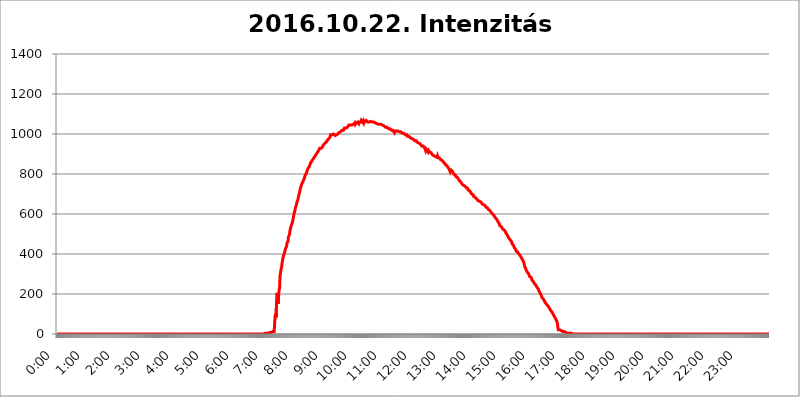
| Category | 2016.10.22. Intenzitás [W/m^2] |
|---|---|
| 0.0 | 0 |
| 0.0006944444444444445 | 0 |
| 0.001388888888888889 | 0 |
| 0.0020833333333333333 | 0 |
| 0.002777777777777778 | 0 |
| 0.003472222222222222 | 0 |
| 0.004166666666666667 | 0 |
| 0.004861111111111111 | 0 |
| 0.005555555555555556 | 0 |
| 0.0062499999999999995 | 0 |
| 0.006944444444444444 | 0 |
| 0.007638888888888889 | 0 |
| 0.008333333333333333 | 0 |
| 0.009027777777777779 | 0 |
| 0.009722222222222222 | 0 |
| 0.010416666666666666 | 0 |
| 0.011111111111111112 | 0 |
| 0.011805555555555555 | 0 |
| 0.012499999999999999 | 0 |
| 0.013194444444444444 | 0 |
| 0.013888888888888888 | 0 |
| 0.014583333333333332 | 0 |
| 0.015277777777777777 | 0 |
| 0.015972222222222224 | 0 |
| 0.016666666666666666 | 0 |
| 0.017361111111111112 | 0 |
| 0.018055555555555557 | 0 |
| 0.01875 | 0 |
| 0.019444444444444445 | 0 |
| 0.02013888888888889 | 0 |
| 0.020833333333333332 | 0 |
| 0.02152777777777778 | 0 |
| 0.022222222222222223 | 0 |
| 0.02291666666666667 | 0 |
| 0.02361111111111111 | 0 |
| 0.024305555555555556 | 0 |
| 0.024999999999999998 | 0 |
| 0.025694444444444447 | 0 |
| 0.02638888888888889 | 0 |
| 0.027083333333333334 | 0 |
| 0.027777777777777776 | 0 |
| 0.02847222222222222 | 0 |
| 0.029166666666666664 | 0 |
| 0.029861111111111113 | 0 |
| 0.030555555555555555 | 0 |
| 0.03125 | 0 |
| 0.03194444444444445 | 0 |
| 0.03263888888888889 | 0 |
| 0.03333333333333333 | 0 |
| 0.034027777777777775 | 0 |
| 0.034722222222222224 | 0 |
| 0.035416666666666666 | 0 |
| 0.036111111111111115 | 0 |
| 0.03680555555555556 | 0 |
| 0.0375 | 0 |
| 0.03819444444444444 | 0 |
| 0.03888888888888889 | 0 |
| 0.03958333333333333 | 0 |
| 0.04027777777777778 | 0 |
| 0.04097222222222222 | 0 |
| 0.041666666666666664 | 0 |
| 0.042361111111111106 | 0 |
| 0.04305555555555556 | 0 |
| 0.043750000000000004 | 0 |
| 0.044444444444444446 | 0 |
| 0.04513888888888889 | 0 |
| 0.04583333333333334 | 0 |
| 0.04652777777777778 | 0 |
| 0.04722222222222222 | 0 |
| 0.04791666666666666 | 0 |
| 0.04861111111111111 | 0 |
| 0.049305555555555554 | 0 |
| 0.049999999999999996 | 0 |
| 0.05069444444444445 | 0 |
| 0.051388888888888894 | 0 |
| 0.052083333333333336 | 0 |
| 0.05277777777777778 | 0 |
| 0.05347222222222222 | 0 |
| 0.05416666666666667 | 0 |
| 0.05486111111111111 | 0 |
| 0.05555555555555555 | 0 |
| 0.05625 | 0 |
| 0.05694444444444444 | 0 |
| 0.057638888888888885 | 0 |
| 0.05833333333333333 | 0 |
| 0.05902777777777778 | 0 |
| 0.059722222222222225 | 0 |
| 0.06041666666666667 | 0 |
| 0.061111111111111116 | 0 |
| 0.06180555555555556 | 0 |
| 0.0625 | 0 |
| 0.06319444444444444 | 0 |
| 0.06388888888888888 | 0 |
| 0.06458333333333334 | 0 |
| 0.06527777777777778 | 0 |
| 0.06597222222222222 | 0 |
| 0.06666666666666667 | 0 |
| 0.06736111111111111 | 0 |
| 0.06805555555555555 | 0 |
| 0.06874999999999999 | 0 |
| 0.06944444444444443 | 0 |
| 0.07013888888888889 | 0 |
| 0.07083333333333333 | 0 |
| 0.07152777777777779 | 0 |
| 0.07222222222222223 | 0 |
| 0.07291666666666667 | 0 |
| 0.07361111111111111 | 0 |
| 0.07430555555555556 | 0 |
| 0.075 | 0 |
| 0.07569444444444444 | 0 |
| 0.0763888888888889 | 0 |
| 0.07708333333333334 | 0 |
| 0.07777777777777778 | 0 |
| 0.07847222222222222 | 0 |
| 0.07916666666666666 | 0 |
| 0.0798611111111111 | 0 |
| 0.08055555555555556 | 0 |
| 0.08125 | 0 |
| 0.08194444444444444 | 0 |
| 0.08263888888888889 | 0 |
| 0.08333333333333333 | 0 |
| 0.08402777777777777 | 0 |
| 0.08472222222222221 | 0 |
| 0.08541666666666665 | 0 |
| 0.08611111111111112 | 0 |
| 0.08680555555555557 | 0 |
| 0.08750000000000001 | 0 |
| 0.08819444444444445 | 0 |
| 0.08888888888888889 | 0 |
| 0.08958333333333333 | 0 |
| 0.09027777777777778 | 0 |
| 0.09097222222222222 | 0 |
| 0.09166666666666667 | 0 |
| 0.09236111111111112 | 0 |
| 0.09305555555555556 | 0 |
| 0.09375 | 0 |
| 0.09444444444444444 | 0 |
| 0.09513888888888888 | 0 |
| 0.09583333333333333 | 0 |
| 0.09652777777777777 | 0 |
| 0.09722222222222222 | 0 |
| 0.09791666666666667 | 0 |
| 0.09861111111111111 | 0 |
| 0.09930555555555555 | 0 |
| 0.09999999999999999 | 0 |
| 0.10069444444444443 | 0 |
| 0.1013888888888889 | 0 |
| 0.10208333333333335 | 0 |
| 0.10277777777777779 | 0 |
| 0.10347222222222223 | 0 |
| 0.10416666666666667 | 0 |
| 0.10486111111111111 | 0 |
| 0.10555555555555556 | 0 |
| 0.10625 | 0 |
| 0.10694444444444444 | 0 |
| 0.1076388888888889 | 0 |
| 0.10833333333333334 | 0 |
| 0.10902777777777778 | 0 |
| 0.10972222222222222 | 0 |
| 0.1111111111111111 | 0 |
| 0.11180555555555556 | 0 |
| 0.11180555555555556 | 0 |
| 0.1125 | 0 |
| 0.11319444444444444 | 0 |
| 0.11388888888888889 | 0 |
| 0.11458333333333333 | 0 |
| 0.11527777777777777 | 0 |
| 0.11597222222222221 | 0 |
| 0.11666666666666665 | 0 |
| 0.1173611111111111 | 0 |
| 0.11805555555555557 | 0 |
| 0.11944444444444445 | 0 |
| 0.12013888888888889 | 0 |
| 0.12083333333333333 | 0 |
| 0.12152777777777778 | 0 |
| 0.12222222222222223 | 0 |
| 0.12291666666666667 | 0 |
| 0.12291666666666667 | 0 |
| 0.12361111111111112 | 0 |
| 0.12430555555555556 | 0 |
| 0.125 | 0 |
| 0.12569444444444444 | 0 |
| 0.12638888888888888 | 0 |
| 0.12708333333333333 | 0 |
| 0.16875 | 0 |
| 0.12847222222222224 | 0 |
| 0.12916666666666668 | 0 |
| 0.12986111111111112 | 0 |
| 0.13055555555555556 | 0 |
| 0.13125 | 0 |
| 0.13194444444444445 | 0 |
| 0.1326388888888889 | 0 |
| 0.13333333333333333 | 0 |
| 0.13402777777777777 | 0 |
| 0.13402777777777777 | 0 |
| 0.13472222222222222 | 0 |
| 0.13541666666666666 | 0 |
| 0.1361111111111111 | 0 |
| 0.13749999999999998 | 0 |
| 0.13819444444444443 | 0 |
| 0.1388888888888889 | 0 |
| 0.13958333333333334 | 0 |
| 0.14027777777777778 | 0 |
| 0.14097222222222222 | 0 |
| 0.14166666666666666 | 0 |
| 0.1423611111111111 | 0 |
| 0.14305555555555557 | 0 |
| 0.14375000000000002 | 0 |
| 0.14444444444444446 | 0 |
| 0.1451388888888889 | 0 |
| 0.1451388888888889 | 0 |
| 0.14652777777777778 | 0 |
| 0.14722222222222223 | 0 |
| 0.14791666666666667 | 0 |
| 0.1486111111111111 | 0 |
| 0.14930555555555555 | 0 |
| 0.15 | 0 |
| 0.15069444444444444 | 0 |
| 0.15138888888888888 | 0 |
| 0.15208333333333332 | 0 |
| 0.15277777777777776 | 0 |
| 0.15347222222222223 | 0 |
| 0.15416666666666667 | 0 |
| 0.15486111111111112 | 0 |
| 0.15555555555555556 | 0 |
| 0.15625 | 0 |
| 0.15694444444444444 | 0 |
| 0.15763888888888888 | 0 |
| 0.15833333333333333 | 0 |
| 0.15902777777777777 | 0 |
| 0.15972222222222224 | 0 |
| 0.16041666666666668 | 0 |
| 0.16111111111111112 | 0 |
| 0.16180555555555556 | 0 |
| 0.1625 | 0 |
| 0.16319444444444445 | 0 |
| 0.1638888888888889 | 0 |
| 0.16458333333333333 | 0 |
| 0.16527777777777777 | 0 |
| 0.16597222222222222 | 0 |
| 0.16666666666666666 | 0 |
| 0.1673611111111111 | 0 |
| 0.16805555555555554 | 0 |
| 0.16874999999999998 | 0 |
| 0.16944444444444443 | 0 |
| 0.17013888888888887 | 0 |
| 0.1708333333333333 | 0 |
| 0.17152777777777775 | 0 |
| 0.17222222222222225 | 0 |
| 0.1729166666666667 | 0 |
| 0.17361111111111113 | 0 |
| 0.17430555555555557 | 0 |
| 0.17500000000000002 | 0 |
| 0.17569444444444446 | 0 |
| 0.1763888888888889 | 0 |
| 0.17708333333333334 | 0 |
| 0.17777777777777778 | 0 |
| 0.17847222222222223 | 0 |
| 0.17916666666666667 | 0 |
| 0.1798611111111111 | 0 |
| 0.18055555555555555 | 0 |
| 0.18125 | 0 |
| 0.18194444444444444 | 0 |
| 0.1826388888888889 | 0 |
| 0.18333333333333335 | 0 |
| 0.1840277777777778 | 0 |
| 0.18472222222222223 | 0 |
| 0.18541666666666667 | 0 |
| 0.18611111111111112 | 0 |
| 0.18680555555555556 | 0 |
| 0.1875 | 0 |
| 0.18819444444444444 | 0 |
| 0.18888888888888888 | 0 |
| 0.18958333333333333 | 0 |
| 0.19027777777777777 | 0 |
| 0.1909722222222222 | 0 |
| 0.19166666666666665 | 0 |
| 0.19236111111111112 | 0 |
| 0.19305555555555554 | 0 |
| 0.19375 | 0 |
| 0.19444444444444445 | 0 |
| 0.1951388888888889 | 0 |
| 0.19583333333333333 | 0 |
| 0.19652777777777777 | 0 |
| 0.19722222222222222 | 0 |
| 0.19791666666666666 | 0 |
| 0.1986111111111111 | 0 |
| 0.19930555555555554 | 0 |
| 0.19999999999999998 | 0 |
| 0.20069444444444443 | 0 |
| 0.20138888888888887 | 0 |
| 0.2020833333333333 | 0 |
| 0.2027777777777778 | 0 |
| 0.2034722222222222 | 0 |
| 0.2041666666666667 | 0 |
| 0.20486111111111113 | 0 |
| 0.20555555555555557 | 0 |
| 0.20625000000000002 | 0 |
| 0.20694444444444446 | 0 |
| 0.2076388888888889 | 0 |
| 0.20833333333333334 | 0 |
| 0.20902777777777778 | 0 |
| 0.20972222222222223 | 0 |
| 0.21041666666666667 | 0 |
| 0.2111111111111111 | 0 |
| 0.21180555555555555 | 0 |
| 0.2125 | 0 |
| 0.21319444444444444 | 0 |
| 0.2138888888888889 | 0 |
| 0.21458333333333335 | 0 |
| 0.2152777777777778 | 0 |
| 0.21597222222222223 | 0 |
| 0.21666666666666667 | 0 |
| 0.21736111111111112 | 0 |
| 0.21805555555555556 | 0 |
| 0.21875 | 0 |
| 0.21944444444444444 | 0 |
| 0.22013888888888888 | 0 |
| 0.22083333333333333 | 0 |
| 0.22152777777777777 | 0 |
| 0.2222222222222222 | 0 |
| 0.22291666666666665 | 0 |
| 0.2236111111111111 | 0 |
| 0.22430555555555556 | 0 |
| 0.225 | 0 |
| 0.22569444444444445 | 0 |
| 0.2263888888888889 | 0 |
| 0.22708333333333333 | 0 |
| 0.22777777777777777 | 0 |
| 0.22847222222222222 | 0 |
| 0.22916666666666666 | 0 |
| 0.2298611111111111 | 0 |
| 0.23055555555555554 | 0 |
| 0.23124999999999998 | 0 |
| 0.23194444444444443 | 0 |
| 0.23263888888888887 | 0 |
| 0.2333333333333333 | 0 |
| 0.2340277777777778 | 0 |
| 0.2347222222222222 | 0 |
| 0.2354166666666667 | 0 |
| 0.23611111111111113 | 0 |
| 0.23680555555555557 | 0 |
| 0.23750000000000002 | 0 |
| 0.23819444444444446 | 0 |
| 0.2388888888888889 | 0 |
| 0.23958333333333334 | 0 |
| 0.24027777777777778 | 0 |
| 0.24097222222222223 | 0 |
| 0.24166666666666667 | 0 |
| 0.2423611111111111 | 0 |
| 0.24305555555555555 | 0 |
| 0.24375 | 0 |
| 0.24444444444444446 | 0 |
| 0.24513888888888888 | 0 |
| 0.24583333333333335 | 0 |
| 0.2465277777777778 | 0 |
| 0.24722222222222223 | 0 |
| 0.24791666666666667 | 0 |
| 0.24861111111111112 | 0 |
| 0.24930555555555556 | 0 |
| 0.25 | 0 |
| 0.25069444444444444 | 0 |
| 0.2513888888888889 | 0 |
| 0.2520833333333333 | 0 |
| 0.25277777777777777 | 0 |
| 0.2534722222222222 | 0 |
| 0.25416666666666665 | 0 |
| 0.2548611111111111 | 0 |
| 0.2555555555555556 | 0 |
| 0.25625000000000003 | 0 |
| 0.2569444444444445 | 0 |
| 0.2576388888888889 | 0 |
| 0.25833333333333336 | 0 |
| 0.2590277777777778 | 0 |
| 0.25972222222222224 | 0 |
| 0.2604166666666667 | 0 |
| 0.2611111111111111 | 0 |
| 0.26180555555555557 | 0 |
| 0.2625 | 0 |
| 0.26319444444444445 | 0 |
| 0.2638888888888889 | 0 |
| 0.26458333333333334 | 0 |
| 0.2652777777777778 | 0 |
| 0.2659722222222222 | 0 |
| 0.26666666666666666 | 0 |
| 0.2673611111111111 | 0 |
| 0.26805555555555555 | 0 |
| 0.26875 | 0 |
| 0.26944444444444443 | 0 |
| 0.2701388888888889 | 0 |
| 0.2708333333333333 | 0 |
| 0.27152777777777776 | 0 |
| 0.2722222222222222 | 0 |
| 0.27291666666666664 | 0 |
| 0.2736111111111111 | 0 |
| 0.2743055555555555 | 0 |
| 0.27499999999999997 | 0 |
| 0.27569444444444446 | 0 |
| 0.27638888888888885 | 0 |
| 0.27708333333333335 | 0 |
| 0.2777777777777778 | 0 |
| 0.27847222222222223 | 0 |
| 0.2791666666666667 | 0 |
| 0.2798611111111111 | 0 |
| 0.28055555555555556 | 0 |
| 0.28125 | 0 |
| 0.28194444444444444 | 0 |
| 0.2826388888888889 | 0 |
| 0.2833333333333333 | 0 |
| 0.28402777777777777 | 0 |
| 0.2847222222222222 | 0 |
| 0.28541666666666665 | 0 |
| 0.28611111111111115 | 0 |
| 0.28680555555555554 | 0 |
| 0.28750000000000003 | 0 |
| 0.2881944444444445 | 0 |
| 0.2888888888888889 | 0 |
| 0.28958333333333336 | 0 |
| 0.2902777777777778 | 3.525 |
| 0.29097222222222224 | 3.525 |
| 0.2916666666666667 | 3.525 |
| 0.2923611111111111 | 3.525 |
| 0.29305555555555557 | 3.525 |
| 0.29375 | 3.525 |
| 0.29444444444444445 | 3.525 |
| 0.2951388888888889 | 3.525 |
| 0.29583333333333334 | 3.525 |
| 0.2965277777777778 | 7.887 |
| 0.2972222222222222 | 7.887 |
| 0.29791666666666666 | 7.887 |
| 0.2986111111111111 | 7.887 |
| 0.29930555555555555 | 7.887 |
| 0.3 | 7.887 |
| 0.30069444444444443 | 7.887 |
| 0.3013888888888889 | 12.257 |
| 0.3020833333333333 | 12.257 |
| 0.30277777777777776 | 12.257 |
| 0.3034722222222222 | 12.257 |
| 0.30416666666666664 | 12.257 |
| 0.3048611111111111 | 47.511 |
| 0.3055555555555555 | 87.692 |
| 0.30624999999999997 | 101.184 |
| 0.3069444444444444 | 83.205 |
| 0.3076388888888889 | 164.605 |
| 0.30833333333333335 | 205.62 |
| 0.3090277777777778 | 182.82 |
| 0.30972222222222223 | 150.964 |
| 0.3104166666666667 | 187.378 |
| 0.3111111111111111 | 219.309 |
| 0.31180555555555556 | 228.436 |
| 0.3125 | 292.259 |
| 0.31319444444444444 | 305.898 |
| 0.3138888888888889 | 324.052 |
| 0.3145833333333333 | 333.113 |
| 0.31527777777777777 | 351.198 |
| 0.3159722222222222 | 369.23 |
| 0.31666666666666665 | 373.729 |
| 0.31736111111111115 | 391.685 |
| 0.31805555555555554 | 396.164 |
| 0.31875000000000003 | 405.108 |
| 0.3194444444444445 | 409.574 |
| 0.3201388888888889 | 427.39 |
| 0.32083333333333336 | 431.833 |
| 0.3215277777777778 | 436.27 |
| 0.32222222222222224 | 453.968 |
| 0.3229166666666667 | 458.38 |
| 0.3236111111111111 | 462.786 |
| 0.32430555555555557 | 484.735 |
| 0.325 | 489.108 |
| 0.32569444444444445 | 497.836 |
| 0.3263888888888889 | 515.223 |
| 0.32708333333333334 | 528.2 |
| 0.3277777777777778 | 536.82 |
| 0.3284722222222222 | 545.416 |
| 0.32916666666666666 | 549.704 |
| 0.3298611111111111 | 558.261 |
| 0.33055555555555555 | 571.049 |
| 0.33125 | 583.779 |
| 0.33194444444444443 | 596.45 |
| 0.3326388888888889 | 609.062 |
| 0.3333333333333333 | 617.436 |
| 0.3340277777777778 | 629.948 |
| 0.3347222222222222 | 638.256 |
| 0.3354166666666667 | 646.537 |
| 0.3361111111111111 | 658.909 |
| 0.3368055555555556 | 663.019 |
| 0.33749999999999997 | 671.22 |
| 0.33819444444444446 | 683.473 |
| 0.33888888888888885 | 695.666 |
| 0.33958333333333335 | 703.762 |
| 0.34027777777777773 | 715.858 |
| 0.34097222222222223 | 727.896 |
| 0.3416666666666666 | 735.89 |
| 0.3423611111111111 | 743.859 |
| 0.3430555555555555 | 751.803 |
| 0.34375 | 751.803 |
| 0.3444444444444445 | 759.723 |
| 0.3451388888888889 | 767.62 |
| 0.3458333333333334 | 771.559 |
| 0.34652777777777777 | 779.42 |
| 0.34722222222222227 | 783.342 |
| 0.34791666666666665 | 795.074 |
| 0.34861111111111115 | 798.974 |
| 0.34930555555555554 | 802.868 |
| 0.35000000000000003 | 798.974 |
| 0.3506944444444444 | 818.392 |
| 0.3513888888888889 | 826.123 |
| 0.3520833333333333 | 829.981 |
| 0.3527777777777778 | 829.981 |
| 0.3534722222222222 | 837.682 |
| 0.3541666666666667 | 845.365 |
| 0.3548611111111111 | 849.199 |
| 0.35555555555555557 | 856.855 |
| 0.35625 | 856.855 |
| 0.35694444444444445 | 864.493 |
| 0.3576388888888889 | 868.305 |
| 0.35833333333333334 | 872.114 |
| 0.3590277777777778 | 875.918 |
| 0.3597222222222222 | 875.918 |
| 0.36041666666666666 | 883.516 |
| 0.3611111111111111 | 887.309 |
| 0.36180555555555555 | 887.309 |
| 0.3625 | 894.885 |
| 0.36319444444444443 | 898.668 |
| 0.3638888888888889 | 902.447 |
| 0.3645833333333333 | 906.223 |
| 0.3652777777777778 | 909.996 |
| 0.3659722222222222 | 913.766 |
| 0.3666666666666667 | 917.534 |
| 0.3673611111111111 | 921.298 |
| 0.3680555555555556 | 928.819 |
| 0.36874999999999997 | 928.819 |
| 0.36944444444444446 | 928.819 |
| 0.37013888888888885 | 928.819 |
| 0.37083333333333335 | 932.576 |
| 0.37152777777777773 | 932.576 |
| 0.37222222222222223 | 936.33 |
| 0.3729166666666666 | 943.832 |
| 0.3736111111111111 | 943.832 |
| 0.3743055555555555 | 947.58 |
| 0.375 | 951.327 |
| 0.3756944444444445 | 951.327 |
| 0.3763888888888889 | 955.071 |
| 0.3770833333333334 | 958.814 |
| 0.37777777777777777 | 962.555 |
| 0.37847222222222227 | 962.555 |
| 0.37916666666666665 | 970.034 |
| 0.37986111111111115 | 973.772 |
| 0.38055555555555554 | 973.772 |
| 0.38125000000000003 | 977.508 |
| 0.3819444444444444 | 977.508 |
| 0.3826388888888889 | 984.98 |
| 0.3833333333333333 | 996.182 |
| 0.3840277777777778 | 996.182 |
| 0.3847222222222222 | 992.448 |
| 0.3854166666666667 | 996.182 |
| 0.3861111111111111 | 999.916 |
| 0.38680555555555557 | 999.916 |
| 0.3875 | 999.916 |
| 0.38819444444444445 | 996.182 |
| 0.3888888888888889 | 996.182 |
| 0.38958333333333334 | 992.448 |
| 0.3902777777777778 | 992.448 |
| 0.3909722222222222 | 992.448 |
| 0.39166666666666666 | 996.182 |
| 0.3923611111111111 | 996.182 |
| 0.39305555555555555 | 996.182 |
| 0.39375 | 999.916 |
| 0.39444444444444443 | 1003.65 |
| 0.3951388888888889 | 1007.383 |
| 0.3958333333333333 | 1007.383 |
| 0.3965277777777778 | 1011.118 |
| 0.3972222222222222 | 1011.118 |
| 0.3979166666666667 | 1011.118 |
| 0.3986111111111111 | 1014.852 |
| 0.3993055555555556 | 1018.587 |
| 0.39999999999999997 | 1022.323 |
| 0.40069444444444446 | 1022.323 |
| 0.40138888888888885 | 1018.587 |
| 0.40208333333333335 | 1022.323 |
| 0.40277777777777773 | 1029.798 |
| 0.40347222222222223 | 1026.06 |
| 0.4041666666666666 | 1033.537 |
| 0.4048611111111111 | 1029.798 |
| 0.4055555555555555 | 1029.798 |
| 0.40625 | 1033.537 |
| 0.4069444444444445 | 1033.537 |
| 0.4076388888888889 | 1033.537 |
| 0.4083333333333334 | 1037.277 |
| 0.40902777777777777 | 1044.762 |
| 0.40972222222222227 | 1044.762 |
| 0.41041666666666665 | 1041.019 |
| 0.41111111111111115 | 1044.762 |
| 0.41180555555555554 | 1048.508 |
| 0.41250000000000003 | 1044.762 |
| 0.4131944444444444 | 1044.762 |
| 0.4138888888888889 | 1044.762 |
| 0.4145833333333333 | 1048.508 |
| 0.4152777777777778 | 1048.508 |
| 0.4159722222222222 | 1052.255 |
| 0.4166666666666667 | 1048.508 |
| 0.4173611111111111 | 1056.004 |
| 0.41805555555555557 | 1048.508 |
| 0.41875 | 1052.255 |
| 0.41944444444444445 | 1056.004 |
| 0.4201388888888889 | 1056.004 |
| 0.42083333333333334 | 1059.756 |
| 0.4215277777777778 | 1059.756 |
| 0.4222222222222222 | 1056.004 |
| 0.42291666666666666 | 1052.255 |
| 0.4236111111111111 | 1059.756 |
| 0.42430555555555555 | 1059.756 |
| 0.425 | 1056.004 |
| 0.42569444444444443 | 1059.756 |
| 0.4263888888888889 | 1067.267 |
| 0.4270833333333333 | 1063.51 |
| 0.4277777777777778 | 1059.756 |
| 0.4284722222222222 | 1063.51 |
| 0.4291666666666667 | 1067.267 |
| 0.4298611111111111 | 1059.756 |
| 0.4305555555555556 | 1071.027 |
| 0.43124999999999997 | 1059.756 |
| 0.43194444444444446 | 1063.51 |
| 0.43263888888888885 | 1059.756 |
| 0.43333333333333335 | 1067.267 |
| 0.43402777777777773 | 1063.51 |
| 0.43472222222222223 | 1063.51 |
| 0.4354166666666666 | 1059.756 |
| 0.4361111111111111 | 1059.756 |
| 0.4368055555555555 | 1063.51 |
| 0.4375 | 1059.756 |
| 0.4381944444444445 | 1059.756 |
| 0.4388888888888889 | 1063.51 |
| 0.4395833333333334 | 1063.51 |
| 0.44027777777777777 | 1067.267 |
| 0.44097222222222227 | 1063.51 |
| 0.44166666666666665 | 1059.756 |
| 0.44236111111111115 | 1059.756 |
| 0.44305555555555554 | 1059.756 |
| 0.44375000000000003 | 1059.756 |
| 0.4444444444444444 | 1059.756 |
| 0.4451388888888889 | 1059.756 |
| 0.4458333333333333 | 1056.004 |
| 0.4465277777777778 | 1056.004 |
| 0.4472222222222222 | 1052.255 |
| 0.4479166666666667 | 1052.255 |
| 0.4486111111111111 | 1056.004 |
| 0.44930555555555557 | 1052.255 |
| 0.45 | 1048.508 |
| 0.45069444444444445 | 1048.508 |
| 0.4513888888888889 | 1048.508 |
| 0.45208333333333334 | 1048.508 |
| 0.4527777777777778 | 1044.762 |
| 0.4534722222222222 | 1044.762 |
| 0.45416666666666666 | 1048.508 |
| 0.4548611111111111 | 1044.762 |
| 0.45555555555555555 | 1044.762 |
| 0.45625 | 1044.762 |
| 0.45694444444444443 | 1044.762 |
| 0.4576388888888889 | 1041.019 |
| 0.4583333333333333 | 1041.019 |
| 0.4590277777777778 | 1037.277 |
| 0.4597222222222222 | 1037.277 |
| 0.4604166666666667 | 1033.537 |
| 0.4611111111111111 | 1033.537 |
| 0.4618055555555556 | 1033.537 |
| 0.46249999999999997 | 1033.537 |
| 0.46319444444444446 | 1029.798 |
| 0.46388888888888885 | 1029.798 |
| 0.46458333333333335 | 1026.06 |
| 0.46527777777777773 | 1022.323 |
| 0.46597222222222223 | 1022.323 |
| 0.4666666666666666 | 1026.06 |
| 0.4673611111111111 | 1022.323 |
| 0.4680555555555555 | 1022.323 |
| 0.46875 | 1018.587 |
| 0.4694444444444445 | 1022.323 |
| 0.4701388888888889 | 1018.587 |
| 0.4708333333333334 | 1018.587 |
| 0.47152777777777777 | 1014.852 |
| 0.47222222222222227 | 1014.852 |
| 0.47291666666666665 | 1007.383 |
| 0.47361111111111115 | 1014.852 |
| 0.47430555555555554 | 1018.587 |
| 0.47500000000000003 | 1014.852 |
| 0.4756944444444444 | 1014.852 |
| 0.4763888888888889 | 1018.587 |
| 0.4770833333333333 | 1014.852 |
| 0.4777777777777778 | 1014.852 |
| 0.4784722222222222 | 1014.852 |
| 0.4791666666666667 | 1011.118 |
| 0.4798611111111111 | 1011.118 |
| 0.48055555555555557 | 1011.118 |
| 0.48125 | 1014.852 |
| 0.48194444444444445 | 1011.118 |
| 0.4826388888888889 | 1007.383 |
| 0.48333333333333334 | 1007.383 |
| 0.4840277777777778 | 1003.65 |
| 0.4847222222222222 | 1003.65 |
| 0.48541666666666666 | 1003.65 |
| 0.4861111111111111 | 1003.65 |
| 0.48680555555555555 | 1003.65 |
| 0.4875 | 999.916 |
| 0.48819444444444443 | 996.182 |
| 0.4888888888888889 | 996.182 |
| 0.4895833333333333 | 996.182 |
| 0.4902777777777778 | 996.182 |
| 0.4909722222222222 | 988.714 |
| 0.4916666666666667 | 992.448 |
| 0.4923611111111111 | 992.448 |
| 0.4930555555555556 | 988.714 |
| 0.49374999999999997 | 988.714 |
| 0.49444444444444446 | 984.98 |
| 0.49513888888888885 | 981.244 |
| 0.49583333333333335 | 984.98 |
| 0.49652777777777773 | 981.244 |
| 0.49722222222222223 | 977.508 |
| 0.4979166666666666 | 977.508 |
| 0.4986111111111111 | 973.772 |
| 0.4993055555555555 | 973.772 |
| 0.5 | 973.772 |
| 0.5006944444444444 | 970.034 |
| 0.5013888888888889 | 966.295 |
| 0.5020833333333333 | 970.034 |
| 0.5027777777777778 | 966.295 |
| 0.5034722222222222 | 966.295 |
| 0.5041666666666667 | 962.555 |
| 0.5048611111111111 | 958.814 |
| 0.5055555555555555 | 962.555 |
| 0.50625 | 955.071 |
| 0.5069444444444444 | 955.071 |
| 0.5076388888888889 | 955.071 |
| 0.5083333333333333 | 951.327 |
| 0.5090277777777777 | 951.327 |
| 0.5097222222222222 | 951.327 |
| 0.5104166666666666 | 947.58 |
| 0.5111111111111112 | 940.082 |
| 0.5118055555555555 | 940.082 |
| 0.5125000000000001 | 940.082 |
| 0.5131944444444444 | 940.082 |
| 0.513888888888889 | 936.33 |
| 0.5145833333333333 | 932.576 |
| 0.5152777777777778 | 928.819 |
| 0.5159722222222222 | 925.06 |
| 0.5166666666666667 | 917.534 |
| 0.517361111111111 | 925.06 |
| 0.5180555555555556 | 925.06 |
| 0.5187499999999999 | 917.534 |
| 0.5194444444444445 | 913.766 |
| 0.5201388888888888 | 909.996 |
| 0.5208333333333334 | 917.534 |
| 0.5215277777777778 | 913.766 |
| 0.5222222222222223 | 909.996 |
| 0.5229166666666667 | 906.223 |
| 0.5236111111111111 | 906.223 |
| 0.5243055555555556 | 906.223 |
| 0.525 | 902.447 |
| 0.5256944444444445 | 902.447 |
| 0.5263888888888889 | 894.885 |
| 0.5270833333333333 | 894.885 |
| 0.5277777777777778 | 894.885 |
| 0.5284722222222222 | 891.099 |
| 0.5291666666666667 | 891.099 |
| 0.5298611111111111 | 891.099 |
| 0.5305555555555556 | 887.309 |
| 0.53125 | 883.516 |
| 0.5319444444444444 | 883.516 |
| 0.5326388888888889 | 883.516 |
| 0.5333333333333333 | 891.099 |
| 0.5340277777777778 | 883.516 |
| 0.5347222222222222 | 879.719 |
| 0.5354166666666667 | 883.516 |
| 0.5361111111111111 | 879.719 |
| 0.5368055555555555 | 875.918 |
| 0.5375 | 872.114 |
| 0.5381944444444444 | 875.918 |
| 0.5388888888888889 | 868.305 |
| 0.5395833333333333 | 868.305 |
| 0.5402777777777777 | 864.493 |
| 0.5409722222222222 | 864.493 |
| 0.5416666666666666 | 860.676 |
| 0.5423611111111112 | 856.855 |
| 0.5430555555555555 | 853.029 |
| 0.5437500000000001 | 856.855 |
| 0.5444444444444444 | 853.029 |
| 0.545138888888889 | 845.365 |
| 0.5458333333333333 | 841.526 |
| 0.5465277777777778 | 845.365 |
| 0.5472222222222222 | 837.682 |
| 0.5479166666666667 | 833.834 |
| 0.548611111111111 | 833.834 |
| 0.5493055555555556 | 826.123 |
| 0.5499999999999999 | 822.26 |
| 0.5506944444444445 | 814.519 |
| 0.5513888888888888 | 826.123 |
| 0.5520833333333334 | 818.392 |
| 0.5527777777777778 | 814.519 |
| 0.5534722222222223 | 814.519 |
| 0.5541666666666667 | 814.519 |
| 0.5548611111111111 | 806.757 |
| 0.5555555555555556 | 806.757 |
| 0.55625 | 798.974 |
| 0.5569444444444445 | 795.074 |
| 0.5576388888888889 | 798.974 |
| 0.5583333333333333 | 795.074 |
| 0.5590277777777778 | 787.258 |
| 0.5597222222222222 | 787.258 |
| 0.5604166666666667 | 783.342 |
| 0.5611111111111111 | 783.342 |
| 0.5618055555555556 | 783.342 |
| 0.5625 | 775.492 |
| 0.5631944444444444 | 771.559 |
| 0.5638888888888889 | 767.62 |
| 0.5645833333333333 | 767.62 |
| 0.5652777777777778 | 763.674 |
| 0.5659722222222222 | 759.723 |
| 0.5666666666666667 | 755.766 |
| 0.5673611111111111 | 751.803 |
| 0.5680555555555555 | 751.803 |
| 0.56875 | 747.834 |
| 0.5694444444444444 | 743.859 |
| 0.5701388888888889 | 743.859 |
| 0.5708333333333333 | 739.877 |
| 0.5715277777777777 | 739.877 |
| 0.5722222222222222 | 739.877 |
| 0.5729166666666666 | 735.89 |
| 0.5736111111111112 | 731.896 |
| 0.5743055555555555 | 731.896 |
| 0.5750000000000001 | 727.896 |
| 0.5756944444444444 | 727.896 |
| 0.576388888888889 | 719.877 |
| 0.5770833333333333 | 719.877 |
| 0.5777777777777778 | 719.877 |
| 0.5784722222222222 | 715.858 |
| 0.5791666666666667 | 711.832 |
| 0.579861111111111 | 707.8 |
| 0.5805555555555556 | 703.762 |
| 0.5812499999999999 | 699.717 |
| 0.5819444444444445 | 695.666 |
| 0.5826388888888888 | 695.666 |
| 0.5833333333333334 | 695.666 |
| 0.5840277777777778 | 687.544 |
| 0.5847222222222223 | 687.544 |
| 0.5854166666666667 | 687.544 |
| 0.5861111111111111 | 683.473 |
| 0.5868055555555556 | 679.395 |
| 0.5875 | 679.395 |
| 0.5881944444444445 | 675.311 |
| 0.5888888888888889 | 675.311 |
| 0.5895833333333333 | 671.22 |
| 0.5902777777777778 | 667.123 |
| 0.5909722222222222 | 667.123 |
| 0.5916666666666667 | 663.019 |
| 0.5923611111111111 | 663.019 |
| 0.5930555555555556 | 658.909 |
| 0.59375 | 658.909 |
| 0.5944444444444444 | 658.909 |
| 0.5951388888888889 | 654.791 |
| 0.5958333333333333 | 650.667 |
| 0.5965277777777778 | 650.667 |
| 0.5972222222222222 | 646.537 |
| 0.5979166666666667 | 646.537 |
| 0.5986111111111111 | 642.4 |
| 0.5993055555555555 | 642.4 |
| 0.6 | 642.4 |
| 0.6006944444444444 | 638.256 |
| 0.6013888888888889 | 634.105 |
| 0.6020833333333333 | 634.105 |
| 0.6027777777777777 | 634.105 |
| 0.6034722222222222 | 629.948 |
| 0.6041666666666666 | 625.784 |
| 0.6048611111111112 | 621.613 |
| 0.6055555555555555 | 621.613 |
| 0.6062500000000001 | 617.436 |
| 0.6069444444444444 | 617.436 |
| 0.607638888888889 | 613.252 |
| 0.6083333333333333 | 609.062 |
| 0.6090277777777778 | 609.062 |
| 0.6097222222222222 | 604.864 |
| 0.6104166666666667 | 600.661 |
| 0.611111111111111 | 600.661 |
| 0.6118055555555556 | 596.45 |
| 0.6124999999999999 | 592.233 |
| 0.6131944444444445 | 588.009 |
| 0.6138888888888888 | 583.779 |
| 0.6145833333333334 | 579.542 |
| 0.6152777777777778 | 579.542 |
| 0.6159722222222223 | 575.299 |
| 0.6166666666666667 | 571.049 |
| 0.6173611111111111 | 566.793 |
| 0.6180555555555556 | 562.53 |
| 0.61875 | 558.261 |
| 0.6194444444444445 | 553.986 |
| 0.6201388888888889 | 549.704 |
| 0.6208333333333333 | 541.121 |
| 0.6215277777777778 | 541.121 |
| 0.6222222222222222 | 541.121 |
| 0.6229166666666667 | 536.82 |
| 0.6236111111111111 | 532.513 |
| 0.6243055555555556 | 532.513 |
| 0.625 | 523.88 |
| 0.6256944444444444 | 519.555 |
| 0.6263888888888889 | 519.555 |
| 0.6270833333333333 | 519.555 |
| 0.6277777777777778 | 515.223 |
| 0.6284722222222222 | 510.885 |
| 0.6291666666666667 | 506.542 |
| 0.6298611111111111 | 502.192 |
| 0.6305555555555555 | 497.836 |
| 0.63125 | 493.475 |
| 0.6319444444444444 | 489.108 |
| 0.6326388888888889 | 484.735 |
| 0.6333333333333333 | 480.356 |
| 0.6340277777777777 | 475.972 |
| 0.6347222222222222 | 471.582 |
| 0.6354166666666666 | 471.582 |
| 0.6361111111111112 | 467.187 |
| 0.6368055555555555 | 462.786 |
| 0.6375000000000001 | 458.38 |
| 0.6381944444444444 | 449.551 |
| 0.638888888888889 | 445.129 |
| 0.6395833333333333 | 445.129 |
| 0.6402777777777778 | 440.702 |
| 0.6409722222222222 | 431.833 |
| 0.6416666666666667 | 431.833 |
| 0.642361111111111 | 427.39 |
| 0.6430555555555556 | 422.943 |
| 0.6437499999999999 | 414.035 |
| 0.6444444444444445 | 414.035 |
| 0.6451388888888888 | 414.035 |
| 0.6458333333333334 | 409.574 |
| 0.6465277777777778 | 405.108 |
| 0.6472222222222223 | 400.638 |
| 0.6479166666666667 | 396.164 |
| 0.6486111111111111 | 396.164 |
| 0.6493055555555556 | 391.685 |
| 0.65 | 387.202 |
| 0.6506944444444445 | 387.202 |
| 0.6513888888888889 | 378.224 |
| 0.6520833333333333 | 373.729 |
| 0.6527777777777778 | 369.23 |
| 0.6534722222222222 | 364.728 |
| 0.6541666666666667 | 360.221 |
| 0.6548611111111111 | 351.198 |
| 0.6555555555555556 | 337.639 |
| 0.65625 | 333.113 |
| 0.6569444444444444 | 328.584 |
| 0.6576388888888889 | 319.517 |
| 0.6583333333333333 | 314.98 |
| 0.6590277777777778 | 310.44 |
| 0.6597222222222222 | 305.898 |
| 0.6604166666666667 | 305.898 |
| 0.6611111111111111 | 301.354 |
| 0.6618055555555555 | 296.808 |
| 0.6625 | 287.709 |
| 0.6631944444444444 | 287.709 |
| 0.6638888888888889 | 287.709 |
| 0.6645833333333333 | 283.156 |
| 0.6652777777777777 | 278.603 |
| 0.6659722222222222 | 269.49 |
| 0.6666666666666666 | 269.49 |
| 0.6673611111111111 | 264.932 |
| 0.6680555555555556 | 260.373 |
| 0.6687500000000001 | 255.813 |
| 0.6694444444444444 | 251.251 |
| 0.6701388888888888 | 251.251 |
| 0.6708333333333334 | 246.689 |
| 0.6715277777777778 | 242.127 |
| 0.6722222222222222 | 237.564 |
| 0.6729166666666666 | 233 |
| 0.6736111111111112 | 228.436 |
| 0.6743055555555556 | 228.436 |
| 0.6749999999999999 | 223.873 |
| 0.6756944444444444 | 214.746 |
| 0.6763888888888889 | 210.182 |
| 0.6770833333333334 | 205.62 |
| 0.6777777777777777 | 201.058 |
| 0.6784722222222223 | 196.497 |
| 0.6791666666666667 | 191.937 |
| 0.6798611111111111 | 182.82 |
| 0.6805555555555555 | 182.82 |
| 0.68125 | 178.264 |
| 0.6819444444444445 | 173.709 |
| 0.6826388888888889 | 169.156 |
| 0.6833333333333332 | 164.605 |
| 0.6840277777777778 | 164.605 |
| 0.6847222222222222 | 155.509 |
| 0.6854166666666667 | 155.509 |
| 0.686111111111111 | 150.964 |
| 0.6868055555555556 | 146.423 |
| 0.6875 | 141.884 |
| 0.6881944444444444 | 141.884 |
| 0.688888888888889 | 137.347 |
| 0.6895833333333333 | 132.814 |
| 0.6902777777777778 | 128.284 |
| 0.6909722222222222 | 123.758 |
| 0.6916666666666668 | 119.235 |
| 0.6923611111111111 | 119.235 |
| 0.6930555555555555 | 114.716 |
| 0.69375 | 110.201 |
| 0.6944444444444445 | 105.69 |
| 0.6951388888888889 | 101.184 |
| 0.6958333333333333 | 101.184 |
| 0.6965277777777777 | 92.184 |
| 0.6972222222222223 | 87.692 |
| 0.6979166666666666 | 83.205 |
| 0.6986111111111111 | 78.722 |
| 0.6993055555555556 | 74.246 |
| 0.7000000000000001 | 74.246 |
| 0.7006944444444444 | 69.775 |
| 0.7013888888888888 | 56.398 |
| 0.7020833333333334 | 34.234 |
| 0.7027777777777778 | 21.024 |
| 0.7034722222222222 | 21.024 |
| 0.7041666666666666 | 21.024 |
| 0.7048611111111112 | 21.024 |
| 0.7055555555555556 | 16.636 |
| 0.7062499999999999 | 16.636 |
| 0.7069444444444444 | 16.636 |
| 0.7076388888888889 | 16.636 |
| 0.7083333333333334 | 12.257 |
| 0.7090277777777777 | 12.257 |
| 0.7097222222222223 | 12.257 |
| 0.7104166666666667 | 12.257 |
| 0.7111111111111111 | 12.257 |
| 0.7118055555555555 | 12.257 |
| 0.7125 | 7.887 |
| 0.7131944444444445 | 7.887 |
| 0.7138888888888889 | 7.887 |
| 0.7145833333333332 | 7.887 |
| 0.7152777777777778 | 3.525 |
| 0.7159722222222222 | 3.525 |
| 0.7166666666666667 | 3.525 |
| 0.717361111111111 | 3.525 |
| 0.7180555555555556 | 3.525 |
| 0.71875 | 3.525 |
| 0.7194444444444444 | 3.525 |
| 0.720138888888889 | 3.525 |
| 0.7208333333333333 | 3.525 |
| 0.7215277777777778 | 3.525 |
| 0.7222222222222222 | 0 |
| 0.7229166666666668 | 0 |
| 0.7236111111111111 | 0 |
| 0.7243055555555555 | 0 |
| 0.725 | 0 |
| 0.7256944444444445 | 0 |
| 0.7263888888888889 | 0 |
| 0.7270833333333333 | 0 |
| 0.7277777777777777 | 0 |
| 0.7284722222222223 | 0 |
| 0.7291666666666666 | 0 |
| 0.7298611111111111 | 0 |
| 0.7305555555555556 | 0 |
| 0.7312500000000001 | 0 |
| 0.7319444444444444 | 0 |
| 0.7326388888888888 | 0 |
| 0.7333333333333334 | 0 |
| 0.7340277777777778 | 0 |
| 0.7347222222222222 | 0 |
| 0.7354166666666666 | 0 |
| 0.7361111111111112 | 0 |
| 0.7368055555555556 | 0 |
| 0.7374999999999999 | 0 |
| 0.7381944444444444 | 0 |
| 0.7388888888888889 | 0 |
| 0.7395833333333334 | 0 |
| 0.7402777777777777 | 0 |
| 0.7409722222222223 | 0 |
| 0.7416666666666667 | 0 |
| 0.7423611111111111 | 0 |
| 0.7430555555555555 | 0 |
| 0.74375 | 0 |
| 0.7444444444444445 | 0 |
| 0.7451388888888889 | 0 |
| 0.7458333333333332 | 0 |
| 0.7465277777777778 | 0 |
| 0.7472222222222222 | 0 |
| 0.7479166666666667 | 0 |
| 0.748611111111111 | 0 |
| 0.7493055555555556 | 0 |
| 0.75 | 0 |
| 0.7506944444444444 | 0 |
| 0.751388888888889 | 0 |
| 0.7520833333333333 | 0 |
| 0.7527777777777778 | 0 |
| 0.7534722222222222 | 0 |
| 0.7541666666666668 | 0 |
| 0.7548611111111111 | 0 |
| 0.7555555555555555 | 0 |
| 0.75625 | 0 |
| 0.7569444444444445 | 0 |
| 0.7576388888888889 | 0 |
| 0.7583333333333333 | 0 |
| 0.7590277777777777 | 0 |
| 0.7597222222222223 | 0 |
| 0.7604166666666666 | 0 |
| 0.7611111111111111 | 0 |
| 0.7618055555555556 | 0 |
| 0.7625000000000001 | 0 |
| 0.7631944444444444 | 0 |
| 0.7638888888888888 | 0 |
| 0.7645833333333334 | 0 |
| 0.7652777777777778 | 0 |
| 0.7659722222222222 | 0 |
| 0.7666666666666666 | 0 |
| 0.7673611111111112 | 0 |
| 0.7680555555555556 | 0 |
| 0.7687499999999999 | 0 |
| 0.7694444444444444 | 0 |
| 0.7701388888888889 | 0 |
| 0.7708333333333334 | 0 |
| 0.7715277777777777 | 0 |
| 0.7722222222222223 | 0 |
| 0.7729166666666667 | 0 |
| 0.7736111111111111 | 0 |
| 0.7743055555555555 | 0 |
| 0.775 | 0 |
| 0.7756944444444445 | 0 |
| 0.7763888888888889 | 0 |
| 0.7770833333333332 | 0 |
| 0.7777777777777778 | 0 |
| 0.7784722222222222 | 0 |
| 0.7791666666666667 | 0 |
| 0.779861111111111 | 0 |
| 0.7805555555555556 | 0 |
| 0.78125 | 0 |
| 0.7819444444444444 | 0 |
| 0.782638888888889 | 0 |
| 0.7833333333333333 | 0 |
| 0.7840277777777778 | 0 |
| 0.7847222222222222 | 0 |
| 0.7854166666666668 | 0 |
| 0.7861111111111111 | 0 |
| 0.7868055555555555 | 0 |
| 0.7875 | 0 |
| 0.7881944444444445 | 0 |
| 0.7888888888888889 | 0 |
| 0.7895833333333333 | 0 |
| 0.7902777777777777 | 0 |
| 0.7909722222222223 | 0 |
| 0.7916666666666666 | 0 |
| 0.7923611111111111 | 0 |
| 0.7930555555555556 | 0 |
| 0.7937500000000001 | 0 |
| 0.7944444444444444 | 0 |
| 0.7951388888888888 | 0 |
| 0.7958333333333334 | 0 |
| 0.7965277777777778 | 0 |
| 0.7972222222222222 | 0 |
| 0.7979166666666666 | 0 |
| 0.7986111111111112 | 0 |
| 0.7993055555555556 | 0 |
| 0.7999999999999999 | 0 |
| 0.8006944444444444 | 0 |
| 0.8013888888888889 | 0 |
| 0.8020833333333334 | 0 |
| 0.8027777777777777 | 0 |
| 0.8034722222222223 | 0 |
| 0.8041666666666667 | 0 |
| 0.8048611111111111 | 0 |
| 0.8055555555555555 | 0 |
| 0.80625 | 0 |
| 0.8069444444444445 | 0 |
| 0.8076388888888889 | 0 |
| 0.8083333333333332 | 0 |
| 0.8090277777777778 | 0 |
| 0.8097222222222222 | 0 |
| 0.8104166666666667 | 0 |
| 0.811111111111111 | 0 |
| 0.8118055555555556 | 0 |
| 0.8125 | 0 |
| 0.8131944444444444 | 0 |
| 0.813888888888889 | 0 |
| 0.8145833333333333 | 0 |
| 0.8152777777777778 | 0 |
| 0.8159722222222222 | 0 |
| 0.8166666666666668 | 0 |
| 0.8173611111111111 | 0 |
| 0.8180555555555555 | 0 |
| 0.81875 | 0 |
| 0.8194444444444445 | 0 |
| 0.8201388888888889 | 0 |
| 0.8208333333333333 | 0 |
| 0.8215277777777777 | 0 |
| 0.8222222222222223 | 0 |
| 0.8229166666666666 | 0 |
| 0.8236111111111111 | 0 |
| 0.8243055555555556 | 0 |
| 0.8250000000000001 | 0 |
| 0.8256944444444444 | 0 |
| 0.8263888888888888 | 0 |
| 0.8270833333333334 | 0 |
| 0.8277777777777778 | 0 |
| 0.8284722222222222 | 0 |
| 0.8291666666666666 | 0 |
| 0.8298611111111112 | 0 |
| 0.8305555555555556 | 0 |
| 0.8312499999999999 | 0 |
| 0.8319444444444444 | 0 |
| 0.8326388888888889 | 0 |
| 0.8333333333333334 | 0 |
| 0.8340277777777777 | 0 |
| 0.8347222222222223 | 0 |
| 0.8354166666666667 | 0 |
| 0.8361111111111111 | 0 |
| 0.8368055555555555 | 0 |
| 0.8375 | 0 |
| 0.8381944444444445 | 0 |
| 0.8388888888888889 | 0 |
| 0.8395833333333332 | 0 |
| 0.8402777777777778 | 0 |
| 0.8409722222222222 | 0 |
| 0.8416666666666667 | 0 |
| 0.842361111111111 | 0 |
| 0.8430555555555556 | 0 |
| 0.84375 | 0 |
| 0.8444444444444444 | 0 |
| 0.845138888888889 | 0 |
| 0.8458333333333333 | 0 |
| 0.8465277777777778 | 0 |
| 0.8472222222222222 | 0 |
| 0.8479166666666668 | 0 |
| 0.8486111111111111 | 0 |
| 0.8493055555555555 | 0 |
| 0.85 | 0 |
| 0.8506944444444445 | 0 |
| 0.8513888888888889 | 0 |
| 0.8520833333333333 | 0 |
| 0.8527777777777777 | 0 |
| 0.8534722222222223 | 0 |
| 0.8541666666666666 | 0 |
| 0.8548611111111111 | 0 |
| 0.8555555555555556 | 0 |
| 0.8562500000000001 | 0 |
| 0.8569444444444444 | 0 |
| 0.8576388888888888 | 0 |
| 0.8583333333333334 | 0 |
| 0.8590277777777778 | 0 |
| 0.8597222222222222 | 0 |
| 0.8604166666666666 | 0 |
| 0.8611111111111112 | 0 |
| 0.8618055555555556 | 0 |
| 0.8624999999999999 | 0 |
| 0.8631944444444444 | 0 |
| 0.8638888888888889 | 0 |
| 0.8645833333333334 | 0 |
| 0.8652777777777777 | 0 |
| 0.8659722222222223 | 0 |
| 0.8666666666666667 | 0 |
| 0.8673611111111111 | 0 |
| 0.8680555555555555 | 0 |
| 0.86875 | 0 |
| 0.8694444444444445 | 0 |
| 0.8701388888888889 | 0 |
| 0.8708333333333332 | 0 |
| 0.8715277777777778 | 0 |
| 0.8722222222222222 | 0 |
| 0.8729166666666667 | 0 |
| 0.873611111111111 | 0 |
| 0.8743055555555556 | 0 |
| 0.875 | 0 |
| 0.8756944444444444 | 0 |
| 0.876388888888889 | 0 |
| 0.8770833333333333 | 0 |
| 0.8777777777777778 | 0 |
| 0.8784722222222222 | 0 |
| 0.8791666666666668 | 0 |
| 0.8798611111111111 | 0 |
| 0.8805555555555555 | 0 |
| 0.88125 | 0 |
| 0.8819444444444445 | 0 |
| 0.8826388888888889 | 0 |
| 0.8833333333333333 | 0 |
| 0.8840277777777777 | 0 |
| 0.8847222222222223 | 0 |
| 0.8854166666666666 | 0 |
| 0.8861111111111111 | 0 |
| 0.8868055555555556 | 0 |
| 0.8875000000000001 | 0 |
| 0.8881944444444444 | 0 |
| 0.8888888888888888 | 0 |
| 0.8895833333333334 | 0 |
| 0.8902777777777778 | 0 |
| 0.8909722222222222 | 0 |
| 0.8916666666666666 | 0 |
| 0.8923611111111112 | 0 |
| 0.8930555555555556 | 0 |
| 0.8937499999999999 | 0 |
| 0.8944444444444444 | 0 |
| 0.8951388888888889 | 0 |
| 0.8958333333333334 | 0 |
| 0.8965277777777777 | 0 |
| 0.8972222222222223 | 0 |
| 0.8979166666666667 | 0 |
| 0.8986111111111111 | 0 |
| 0.8993055555555555 | 0 |
| 0.9 | 0 |
| 0.9006944444444445 | 0 |
| 0.9013888888888889 | 0 |
| 0.9020833333333332 | 0 |
| 0.9027777777777778 | 0 |
| 0.9034722222222222 | 0 |
| 0.9041666666666667 | 0 |
| 0.904861111111111 | 0 |
| 0.9055555555555556 | 0 |
| 0.90625 | 0 |
| 0.9069444444444444 | 0 |
| 0.907638888888889 | 0 |
| 0.9083333333333333 | 0 |
| 0.9090277777777778 | 0 |
| 0.9097222222222222 | 0 |
| 0.9104166666666668 | 0 |
| 0.9111111111111111 | 0 |
| 0.9118055555555555 | 0 |
| 0.9125 | 0 |
| 0.9131944444444445 | 0 |
| 0.9138888888888889 | 0 |
| 0.9145833333333333 | 0 |
| 0.9152777777777777 | 0 |
| 0.9159722222222223 | 0 |
| 0.9166666666666666 | 0 |
| 0.9173611111111111 | 0 |
| 0.9180555555555556 | 0 |
| 0.9187500000000001 | 0 |
| 0.9194444444444444 | 0 |
| 0.9201388888888888 | 0 |
| 0.9208333333333334 | 0 |
| 0.9215277777777778 | 0 |
| 0.9222222222222222 | 0 |
| 0.9229166666666666 | 0 |
| 0.9236111111111112 | 0 |
| 0.9243055555555556 | 0 |
| 0.9249999999999999 | 0 |
| 0.9256944444444444 | 0 |
| 0.9263888888888889 | 0 |
| 0.9270833333333334 | 0 |
| 0.9277777777777777 | 0 |
| 0.9284722222222223 | 0 |
| 0.9291666666666667 | 0 |
| 0.9298611111111111 | 0 |
| 0.9305555555555555 | 0 |
| 0.93125 | 0 |
| 0.9319444444444445 | 0 |
| 0.9326388888888889 | 0 |
| 0.9333333333333332 | 0 |
| 0.9340277777777778 | 0 |
| 0.9347222222222222 | 0 |
| 0.9354166666666667 | 0 |
| 0.936111111111111 | 0 |
| 0.9368055555555556 | 0 |
| 0.9375 | 0 |
| 0.9381944444444444 | 0 |
| 0.938888888888889 | 0 |
| 0.9395833333333333 | 0 |
| 0.9402777777777778 | 0 |
| 0.9409722222222222 | 0 |
| 0.9416666666666668 | 0 |
| 0.9423611111111111 | 0 |
| 0.9430555555555555 | 0 |
| 0.94375 | 0 |
| 0.9444444444444445 | 0 |
| 0.9451388888888889 | 0 |
| 0.9458333333333333 | 0 |
| 0.9465277777777777 | 0 |
| 0.9472222222222223 | 0 |
| 0.9479166666666666 | 0 |
| 0.9486111111111111 | 0 |
| 0.9493055555555556 | 0 |
| 0.9500000000000001 | 0 |
| 0.9506944444444444 | 0 |
| 0.9513888888888888 | 0 |
| 0.9520833333333334 | 0 |
| 0.9527777777777778 | 0 |
| 0.9534722222222222 | 0 |
| 0.9541666666666666 | 0 |
| 0.9548611111111112 | 0 |
| 0.9555555555555556 | 0 |
| 0.9562499999999999 | 0 |
| 0.9569444444444444 | 0 |
| 0.9576388888888889 | 0 |
| 0.9583333333333334 | 0 |
| 0.9590277777777777 | 0 |
| 0.9597222222222223 | 0 |
| 0.9604166666666667 | 0 |
| 0.9611111111111111 | 0 |
| 0.9618055555555555 | 0 |
| 0.9625 | 0 |
| 0.9631944444444445 | 0 |
| 0.9638888888888889 | 0 |
| 0.9645833333333332 | 0 |
| 0.9652777777777778 | 0 |
| 0.9659722222222222 | 0 |
| 0.9666666666666667 | 0 |
| 0.967361111111111 | 0 |
| 0.9680555555555556 | 0 |
| 0.96875 | 0 |
| 0.9694444444444444 | 0 |
| 0.970138888888889 | 0 |
| 0.9708333333333333 | 0 |
| 0.9715277777777778 | 0 |
| 0.9722222222222222 | 0 |
| 0.9729166666666668 | 0 |
| 0.9736111111111111 | 0 |
| 0.9743055555555555 | 0 |
| 0.975 | 0 |
| 0.9756944444444445 | 0 |
| 0.9763888888888889 | 0 |
| 0.9770833333333333 | 0 |
| 0.9777777777777777 | 0 |
| 0.9784722222222223 | 0 |
| 0.9791666666666666 | 0 |
| 0.9798611111111111 | 0 |
| 0.9805555555555556 | 0 |
| 0.9812500000000001 | 0 |
| 0.9819444444444444 | 0 |
| 0.9826388888888888 | 0 |
| 0.9833333333333334 | 0 |
| 0.9840277777777778 | 0 |
| 0.9847222222222222 | 0 |
| 0.9854166666666666 | 0 |
| 0.9861111111111112 | 0 |
| 0.9868055555555556 | 0 |
| 0.9874999999999999 | 0 |
| 0.9881944444444444 | 0 |
| 0.9888888888888889 | 0 |
| 0.9895833333333334 | 0 |
| 0.9902777777777777 | 0 |
| 0.9909722222222223 | 0 |
| 0.9916666666666667 | 0 |
| 0.9923611111111111 | 0 |
| 0.9930555555555555 | 0 |
| 0.99375 | 0 |
| 0.9944444444444445 | 0 |
| 0.9951388888888889 | 0 |
| 0.9958333333333332 | 0 |
| 0.9965277777777778 | 0 |
| 0.9972222222222222 | 0 |
| 0.9979166666666667 | 0 |
| 0.998611111111111 | 0 |
| 0.9993055555555556 | 0 |